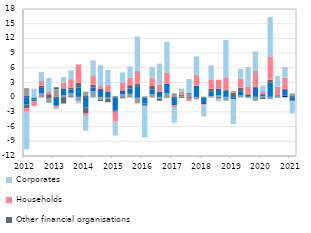
| Category | Non-profit and other organisations | Local authorities  | Currency in circulation | Other financial organisations | Households | Corporates |
|---|---|---|---|---|---|---|
| 2012 | 0.202 | 1.641 | -1.502 | -0.756 | -0.691 | -7.686 |
| II | 0.002 | -0.188 | -0.341 | -0.312 | -0.998 | 1.747 |
| III | 0.11 | 0.664 | 1.273 | 0.274 | 0.972 | 1.84 |
| IV | -0.138 | -0.873 | -0.098 | 0.61 | 0.594 | 2.749 |
| 2013 | 0.079 | 1.527 | -1.754 | 0.426 | -0.373 | -0.296 |
| II | 0.059 | 0.305 | 1.437 | -1.286 | 1.19 | 1.148 |
| III | 0.165 | 0.682 | 0.754 | 0.325 | 1.76 | 1.79 |
| IV | 0.076 | -0.87 | 1.873 | 1.027 | 3.718 | -0.415 |
| 2014 | 0.199 | 0.924 | -2.085 | -1.142 | -0.569 | -3.023 |
| II | 0.035 | 1.231 | 0.74 | 0.578 | 1.742 | 3.202 |
| III | 0.178 | -0.545 | 1.556 | -0.251 | 0.516 | 4.284 |
| IV | -0.104 | -0.237 | 1.19 | -0.68 | 1.391 | 3 |
| 2015 | -0.031 | 0.277 | -2.623 | -0.313 | -1.902 | -2.981 |
| II | 0.129 | 0.455 | 0.809 | -0.218 | 1.631 | 2.039 |
| III | 0.145 | 0.535 | 1.129 | 0.641 | 1.533 | 2.287 |
| IV | -0.109 | -1.155 | 2.237 | 0.437 | 2.676 | 7.032 |
| 2016 | 0.104 | -0.104 | -1.193 | -0.452 | -0.054 | -6.424 |
| II | -0.033 | 0.597 | 0.912 | 0.894 | 1.489 | 2.276 |
| III | 0.058 | -0.277 | 1.097 | -0.443 | 1.429 | 4.281 |
| IV | -0.001 | 0.781 | 1.984 | -0.118 | 2.31 | 6.213 |
| 2017 | 0.133 | 0.64 | -1.599 | 0.025 | -0.411 | -3.193 |
| II | 0.059 | 0.207 | -0.138 | 0.273 | 0.541 | 0.678 |
| III | 0.02 | 0.6 | 0.199 | -0.281 | -0.487 | 2.895 |
| IV | 0.183 | -0.435 | 2.116 | 0.066 | 2.148 | 3.798 |
| 2018 | -0.069 | 0.088 | -1.382 | 0.022 | -0.202 | -2.284 |
| II | 0.083 | 0.156 | 0.854 | 0.654 | 1.762 | 2.986 |
| III | 0.089 | 0.272 | 1.347 | -0.301 | 1.848 | -0.557 |
| IV | 0.082 | -0.727 | 1.258 | 0.234 | 2.481 | 7.641 |
| 2019 | 0.187 | 0.021 | -0.439 | 0.661 | 0.411 | -5.065 |
| II | -0.015 | 0.395 | 0.82 | 0.717 | 1.911 | 1.934 |
| III | 0.109 | -0.155 | 0.363 | 0.139 | 1.592 | 3.965 |
| IV | 0.106 | -0.756 | 1.801 | 0.269 | 3.171 | 3.974 |
| 2020 | -0.044 | 0.196 | 0.422 | -0.345 | 0.62 | 1.138 |
| II | 0.14 | -0.412 | 2.831 | 0.621 | 4.751 | 8.057 |
| III | 0.136 | 0.188 | -0.059 | 0.127 | 1.713 | 2.143 |
| IV | 0.323 | 0.01 | 1.279 | 0.077 | 2.288 | 2.209 |
| 2021 | 0.182 | 0.496 | -0.666 | -0.114 | 0.112 | -2.538 |